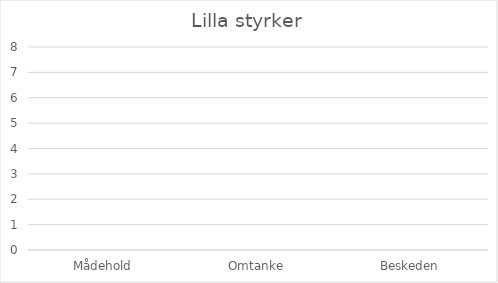
| Category | Series 0 |
|---|---|
| Mådehold | 0 |
| Omtanke | 0 |
| Beskeden | 0 |